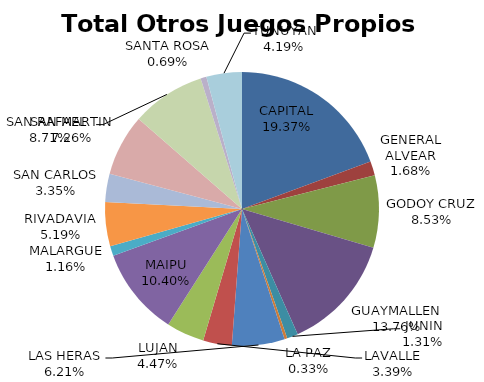
| Category | Total Otros Juegos Propios Beneficio |
|---|---|
| CAPITAL | 164449.71 |
| GENERAL ALVEAR | 14213.38 |
| GODOY CRUZ | 72442.34 |
| GUAYMALLEN | 116852.82 |
| JUNIN | 11105.38 |
| LA PAZ | 2768.17 |
| LAS HERAS | 52740.88 |
| LAVALLE | 28785.59 |
| LUJAN | 37975.09 |
| MAIPU | 88323.8 |
| MALARGUE | 9853.1 |
| RIVADAVIA | 44091.8 |
| SAN CARLOS | 28398.58 |
| SAN MARTIN | 61637.99 |
| SAN RAFAEL  | 73918.81 |
| SANTA ROSA | 5874.2 |
| TUNUYAN | 35594.06 |